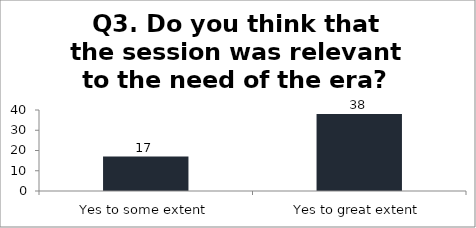
| Category | Q3. Do you think that the session was relevant to the need of the era? |
|---|---|
| Yes to some extent | 17 |
| Yes to great extent | 38 |